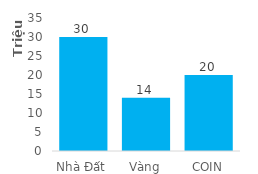
| Category | Total |
|---|---|
| Nhà Đất | 30000000 |
| Vàng | 14000000 |
| COIN | 20000000 |